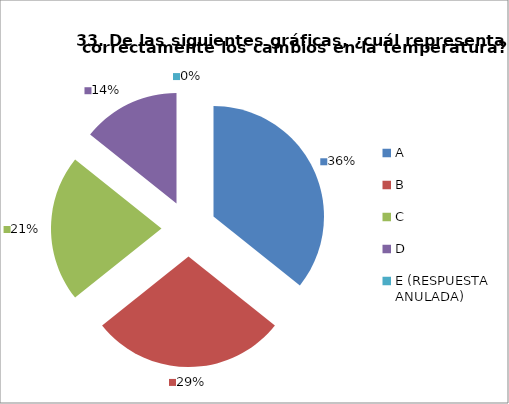
| Category | CANTIDAD DE RESPUESTAS PREGUNTA (33) | PORCENTAJE |
|---|---|---|
| A | 10 | 0.357 |
| B | 8 | 0.286 |
| C | 6 | 0.214 |
| D | 4 | 0.143 |
| E (RESPUESTA ANULADA) | 0 | 0 |